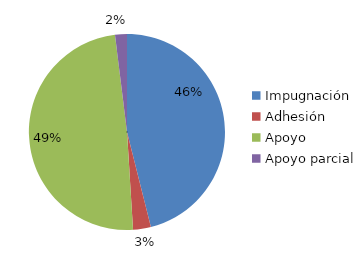
| Category | Series 0 |
|---|---|
| Impugnación | 47 |
| Adhesión | 3 |
| Apoyo | 50 |
| Apoyo parcial | 2 |